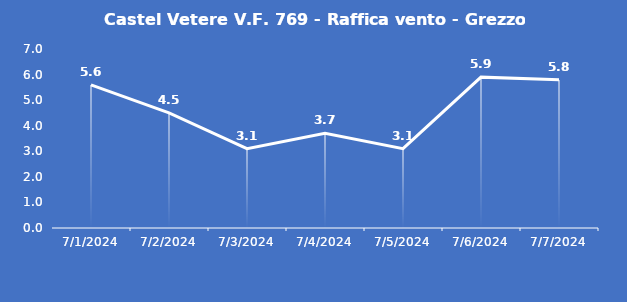
| Category | Castel Vetere V.F. 769 - Raffica vento - Grezzo (m/s) |
|---|---|
| 7/1/24 | 5.6 |
| 7/2/24 | 4.5 |
| 7/3/24 | 3.1 |
| 7/4/24 | 3.7 |
| 7/5/24 | 3.1 |
| 7/6/24 | 5.9 |
| 7/7/24 | 5.8 |